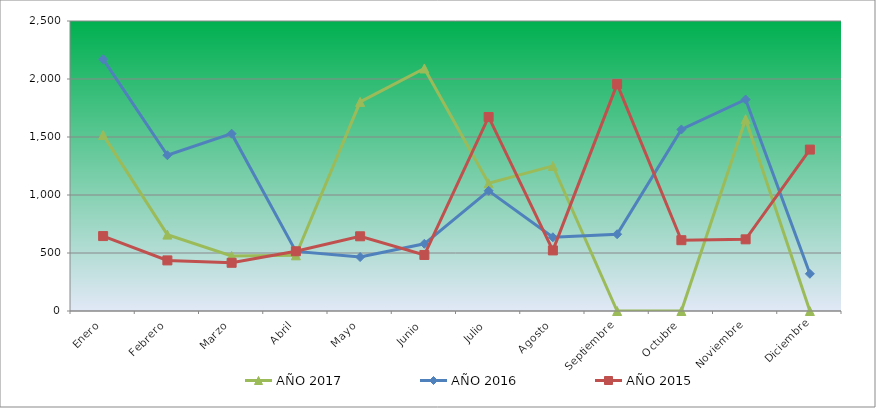
| Category | AÑO 2017 | AÑO 2016 | AÑO 2015 |
|---|---|---|---|
| Enero | 1518.116 | 2170.796 | 645.905 |
| Febrero | 658.437 | 1342.77 | 436.22 |
| Marzo | 474.516 | 1528.595 | 415.626 |
| Abril | 480.034 | 513.781 | 514.851 |
| Mayo | 1802.441 | 465.028 | 644.032 |
| Junio | 2090.872 | 579.41 | 483.024 |
| Julio | 1101.383 | 1036.263 | 1672.79 |
| Agosto | 1250.662 | 635.663 | 522.34 |
| Septiembre | 0 | 661.915 | 1955.878 |
| Octubre | 0 | 1564.685 | 610.333 |
| Noviembre | 1653.711 | 1823.214 | 617.822 |
| Diciembre | 0 | 320.644 | 1391.502 |